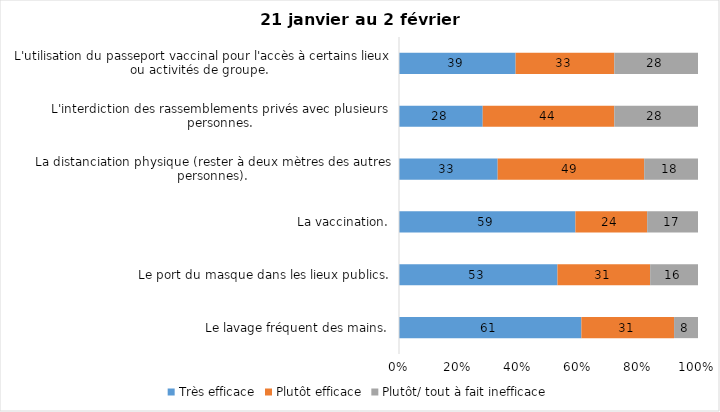
| Category | Très efficace | Plutôt efficace | Plutôt/ tout à fait inefficace |
|---|---|---|---|
| Le lavage fréquent des mains. | 61 | 31 | 8 |
| Le port du masque dans les lieux publics. | 53 | 31 | 16 |
| La vaccination. | 59 | 24 | 17 |
| La distanciation physique (rester à deux mètres des autres personnes). | 33 | 49 | 18 |
| L'interdiction des rassemblements privés avec plusieurs personnes. | 28 | 44 | 28 |
| L'utilisation du passeport vaccinal pour l'accès à certains lieux ou activités de groupe.  | 39 | 33 | 28 |